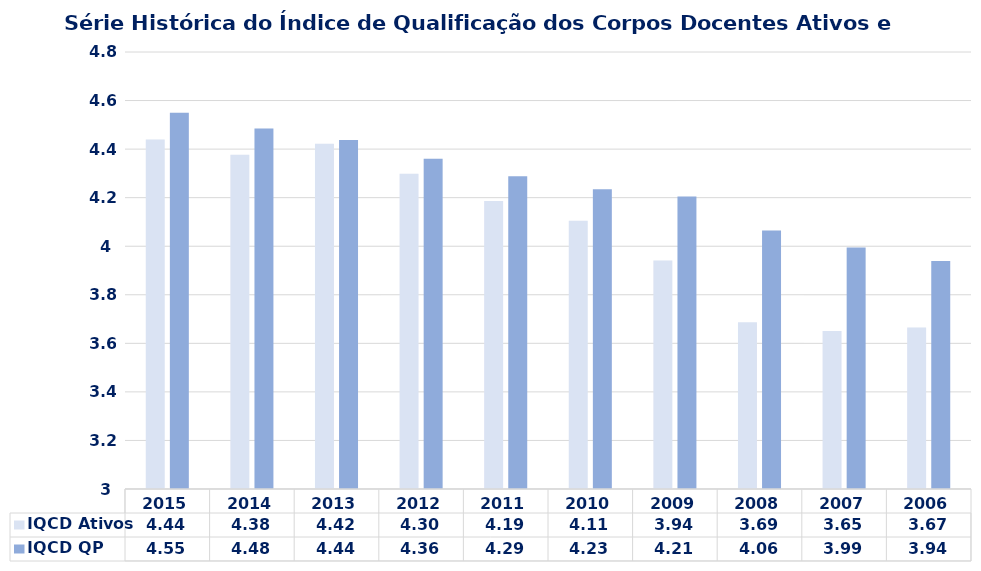
| Category | IQCD Ativos | IQCD QP |
|---|---|---|
| 2015 | 4.44 | 4.55 |
| 2014 | 4.377 | 4.485 |
| 2013 | 4.422 | 4.438 |
| 2012 | 4.299 | 4.361 |
| 2011 | 4.186 | 4.289 |
| 2010 | 4.105 | 4.234 |
| 2009 | 3.941 | 4.205 |
| 2008 | 3.686 | 4.065 |
| 2007 | 3.651 | 3.994 |
| 2006 | 3.666 | 3.939 |